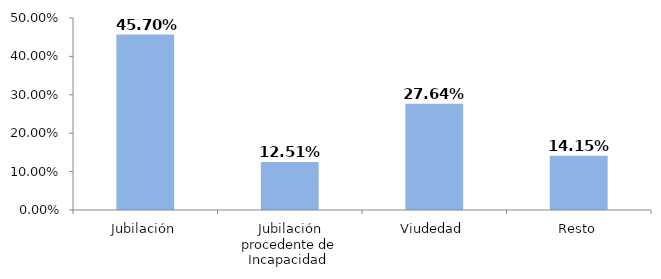
| Category | Series 0 |
|---|---|
| Jubilación | 0.457 |
| Jubilación procedente de Incapacidad  | 0.125 |
| Viudedad | 0.276 |
| Resto | 0.142 |